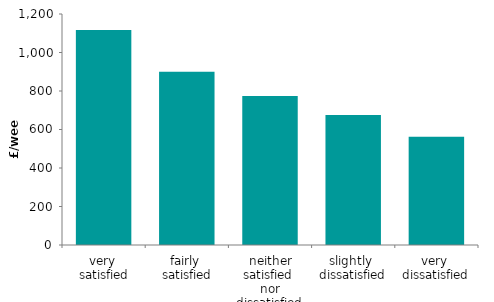
| Category | Series 0 |
|---|---|
| very 
satisfied | 1116.794 |
| fairly 
satisfied | 899.713 |
| neither satisfied 
nor dissatisfied | 774.082 |
| slightly 
dissatisfied | 675.606 |
| very 
dissatisfied | 561.743 |